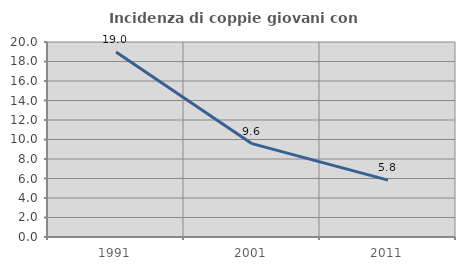
| Category | Incidenza di coppie giovani con figli |
|---|---|
| 1991.0 | 18.962 |
| 2001.0 | 9.574 |
| 2011.0 | 5.832 |